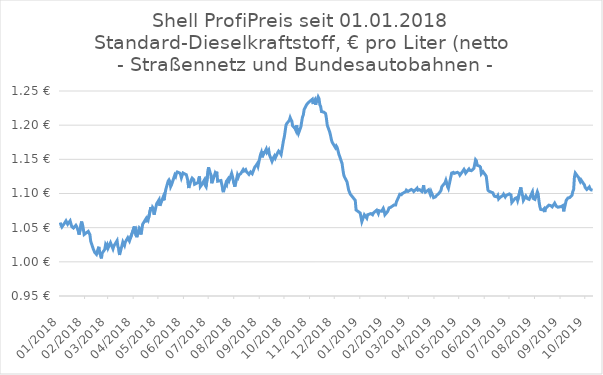
| Category | Diesel |
|---|---|
| 2019-10-12 | 1.105 |
| 2019-10-11 | 1.104 |
| 2019-10-10 | 1.105 |
| 2019-10-09 | 1.107 |
| 2019-10-08 | 1.11 |
| 2019-10-05 | 1.106 |
| 2019-10-03 | 1.109 |
| 2019-10-02 | 1.113 |
| 2019-10-01 | 1.114 |
| 2019-09-28 | 1.12 |
| 2019-09-27 | 1.117 |
| 2019-09-26 | 1.12 |
| 2019-09-25 | 1.123 |
| 2019-09-24 | 1.125 |
| 2019-09-21 | 1.13 |
| 2019-09-20 | 1.124 |
| 2019-09-19 | 1.106 |
| 2019-09-18 | 1.103 |
| 2019-09-17 | 1.097 |
| 2019-09-14 | 1.094 |
| 2019-09-13 | 1.093 |
| 2019-09-12 | 1.093 |
| 2019-09-11 | 1.093 |
| 2019-09-10 | 1.09 |
| 2019-09-07 | 1.074 |
| 2019-09-06 | 1.082 |
| 2019-09-05 | 1.082 |
| 2019-09-04 | 1.081 |
| 2019-09-03 | 1.082 |
| 2019-08-31 | 1.08 |
| 2019-08-30 | 1.081 |
| 2019-08-29 | 1.081 |
| 2019-08-28 | 1.081 |
| 2019-08-27 | 1.086 |
| 2019-08-24 | 1.08 |
| 2019-08-23 | 1.08 |
| 2019-08-22 | 1.082 |
| 2019-08-21 | 1.082 |
| 2019-08-20 | 1.083 |
| 2019-08-17 | 1.079 |
| 2019-08-16 | 1.078 |
| 2019-08-15 | 1.073 |
| 2019-08-14 | 1.077 |
| 2019-08-13 | 1.076 |
| 2019-08-10 | 1.077 |
| 2019-08-09 | 1.081 |
| 2019-08-08 | 1.088 |
| 2019-08-07 | 1.099 |
| 2019-08-06 | 1.102 |
| 2019-08-03 | 1.091 |
| 2019-08-02 | 1.091 |
| 2019-08-01 | 1.093 |
| 2019-07-31 | 1.102 |
| 2019-07-30 | 1.1 |
| 2019-07-27 | 1.091 |
| 2019-07-26 | 1.092 |
| 2019-07-25 | 1.092 |
| 2019-07-24 | 1.093 |
| 2019-07-23 | 1.096 |
| 2019-07-20 | 1.09 |
| 2019-07-19 | 1.097 |
| 2019-07-18 | 1.102 |
| 2019-07-17 | 1.109 |
| 2019-07-16 | 1.108 |
| 2019-07-13 | 1.09 |
| 2019-07-12 | 1.094 |
| 2019-07-11 | 1.093 |
| 2019-07-10 | 1.093 |
| 2019-07-09 | 1.092 |
| 2019-07-06 | 1.087 |
| 2019-07-05 | 1.098 |
| 2019-07-04 | 1.097 |
| 2019-07-03 | 1.099 |
| 2019-07-02 | 1.1 |
| 2019-06-29 | 1.097 |
| 2019-06-28 | 1.095 |
| 2019-06-27 | 1.096 |
| 2019-06-26 | 1.099 |
| 2019-06-25 | 1.097 |
| 2019-06-22 | 1.094 |
| 2019-06-20 | 1.092 |
| 2019-06-19 | 1.097 |
| 2019-06-18 | 1.095 |
| 2019-06-15 | 1.096 |
| 2019-06-14 | 1.098 |
| 2019-06-13 | 1.101 |
| 2019-06-12 | 1.102 |
| 2019-06-08 | 1.104 |
| 2019-06-07 | 1.105 |
| 2019-06-06 | 1.115 |
| 2019-06-05 | 1.125 |
| 2019-06-04 | 1.127 |
| 2019-06-01 | 1.132 |
| 2019-05-30 | 1.129 |
| 2019-05-29 | 1.138 |
| 2019-05-28 | 1.14 |
| 2019-05-25 | 1.141 |
| 2019-05-24 | 1.148 |
| 2019-05-23 | 1.149 |
| 2019-05-22 | 1.15 |
| 2019-05-21 | 1.137 |
| 2019-05-18 | 1.133 |
| 2019-05-17 | 1.134 |
| 2019-05-16 | 1.134 |
| 2019-05-15 | 1.136 |
| 2019-05-14 | 1.134 |
| 2019-05-11 | 1.13 |
| 2019-05-10 | 1.133 |
| 2019-05-09 | 1.135 |
| 2019-05-08 | 1.135 |
| 2019-05-07 | 1.132 |
| 2019-05-04 | 1.127 |
| 2019-05-03 | 1.129 |
| 2019-05-01 | 1.131 |
| 2019-04-30 | 1.132 |
| 2019-04-27 | 1.129 |
| 2019-04-26 | 1.131 |
| 2019-04-25 | 1.13 |
| 2019-04-24 | 1.13 |
| 2019-04-20 | 1.107 |
| 2019-04-19 | 1.11 |
| 2019-04-18 | 1.115 |
| 2019-04-17 | 1.119 |
| 2019-04-16 | 1.116 |
| 2019-04-13 | 1.111 |
| 2019-04-12 | 1.11 |
| 2019-04-11 | 1.104 |
| 2019-04-10 | 1.103 |
| 2019-04-09 | 1.101 |
| 2019-04-06 | 1.097 |
| 2019-04-05 | 1.098 |
| 2019-04-04 | 1.095 |
| 2019-04-03 | 1.094 |
| 2019-04-02 | 1.094 |
| 2019-03-30 | 1.103 |
| 2019-03-29 | 1.099 |
| 2019-03-28 | 1.1 |
| 2019-03-27 | 1.105 |
| 2019-03-26 | 1.105 |
| 2019-03-23 | 1.102 |
| 2019-03-22 | 1.104 |
| 2019-03-21 | 1.112 |
| 2019-03-20 | 1.105 |
| 2019-03-19 | 1.103 |
| 2019-03-16 | 1.106 |
| 2019-03-15 | 1.105 |
| 2019-03-14 | 1.105 |
| 2019-03-13 | 1.108 |
| 2019-03-12 | 1.108 |
| 2019-03-09 | 1.103 |
| 2019-03-08 | 1.104 |
| 2019-03-07 | 1.104 |
| 2019-03-06 | 1.106 |
| 2019-03-05 | 1.107 |
| 2019-03-02 | 1.103 |
| 2019-03-01 | 1.102 |
| 2019-02-28 | 1.105 |
| 2019-02-27 | 1.102 |
| 2019-02-26 | 1.103 |
| 2019-02-23 | 1.1 |
| 2019-02-22 | 1.098 |
| 2019-02-21 | 1.099 |
| 2019-02-20 | 1.099 |
| 2019-02-19 | 1.096 |
| 2019-02-16 | 1.088 |
| 2019-02-15 | 1.083 |
| 2019-02-14 | 1.084 |
| 2019-02-13 | 1.083 |
| 2019-02-12 | 1.084 |
| 2019-02-09 | 1.08 |
| 2019-02-08 | 1.08 |
| 2019-02-07 | 1.079 |
| 2019-02-06 | 1.076 |
| 2019-02-05 | 1.073 |
| 2019-02-02 | 1.069 |
| 2019-02-01 | 1.075 |
| 2019-01-31 | 1.078 |
| 2019-01-30 | 1.077 |
| 2019-01-29 | 1.074 |
| 2019-01-26 | 1.075 |
| 2019-01-25 | 1.071 |
| 2019-01-24 | 1.071 |
| 2019-01-23 | 1.076 |
| 2019-01-22 | 1.075 |
| 2019-01-19 | 1.072 |
| 2019-01-18 | 1.069 |
| 2019-01-17 | 1.07 |
| 2019-01-16 | 1.071 |
| 2019-01-15 | 1.071 |
| 2019-01-12 | 1.069 |
| 2019-01-11 | 1.064 |
| 2019-01-10 | 1.066 |
| 2019-01-09 | 1.065 |
| 2019-01-08 | 1.069 |
| 2019-01-05 | 1.059 |
| 2019-01-04 | 1.06 |
| 2019-01-03 | 1.071 |
| 2018-12-29 | 1.076 |
| 2018-12-28 | 1.09 |
| 2018-12-22 | 1.099 |
| 2018-12-21 | 1.102 |
| 2018-12-20 | 1.105 |
| 2018-12-18 | 1.117 |
| 2018-12-15 | 1.124 |
| 2018-12-14 | 1.128 |
| 2018-12-13 | 1.135 |
| 2018-12-12 | 1.144 |
| 2018-12-11 | 1.145 |
| 2018-12-08 | 1.158 |
| 2018-12-07 | 1.163 |
| 2018-12-06 | 1.168 |
| 2018-12-05 | 1.17 |
| 2018-12-04 | 1.167 |
| 2018-12-01 | 1.173 |
| 2018-11-30 | 1.175 |
| 2018-11-29 | 1.179 |
| 2018-11-28 | 1.185 |
| 2018-11-27 | 1.19 |
| 2018-11-24 | 1.2 |
| 2018-11-23 | 1.21 |
| 2018-11-22 | 1.217 |
| 2018-11-21 | 1.218 |
| 2018-11-20 | 1.219 |
| 2018-11-17 | 1.22 |
| 2018-11-16 | 1.228 |
| 2018-11-15 | 1.23 |
| 2018-11-14 | 1.239 |
| 2018-11-13 | 1.241 |
| 2018-11-10 | 1.23 |
| 2018-11-09 | 1.237 |
| 2018-11-08 | 1.235 |
| 2018-11-07 | 1.231 |
| 2018-11-06 | 1.238 |
| 2018-11-03 | 1.235 |
| 2018-11-01 | 1.233 |
| 2018-10-31 | 1.233 |
| 2018-10-30 | 1.23 |
| 2018-10-27 | 1.223 |
| 2018-10-26 | 1.215 |
| 2018-10-25 | 1.212 |
| 2018-10-24 | 1.205 |
| 2018-10-23 | 1.198 |
| 2018-10-20 | 1.188 |
| 2018-10-19 | 1.191 |
| 2018-10-18 | 1.2 |
| 2018-10-17 | 1.192 |
| 2018-10-16 | 1.195 |
| 2018-10-13 | 1.199 |
| 2018-10-12 | 1.206 |
| 2018-10-11 | 1.208 |
| 2018-10-10 | 1.211 |
| 2018-10-09 | 1.207 |
| 2018-10-06 | 1.202 |
| 2018-10-05 | 1.2 |
| 2018-10-03 | 1.184 |
| 2018-10-02 | 1.178 |
| 2018-09-29 | 1.157 |
| 2018-09-28 | 1.159 |
| 2018-09-27 | 1.16 |
| 2018-09-26 | 1.162 |
| 2018-09-25 | 1.16 |
| 2018-09-22 | 1.152 |
| 2018-09-21 | 1.155 |
| 2018-09-20 | 1.153 |
| 2018-09-19 | 1.15 |
| 2018-09-18 | 1.147 |
| 2018-09-15 | 1.156 |
| 2018-09-14 | 1.164 |
| 2018-09-13 | 1.162 |
| 2018-09-12 | 1.16 |
| 2018-09-11 | 1.165 |
| 2018-09-08 | 1.158 |
| 2018-09-07 | 1.162 |
| 2018-09-06 | 1.153 |
| 2018-09-05 | 1.16 |
| 2018-09-04 | 1.157 |
| 2018-09-01 | 1.14 |
| 2018-08-31 | 1.144 |
| 2018-08-30 | 1.142 |
| 2018-08-29 | 1.14 |
| 2018-08-28 | 1.138 |
| 2018-08-25 | 1.129 |
| 2018-08-23 | 1.132 |
| 2018-08-22 | 1.13 |
| 2018-08-21 | 1.128 |
| 2018-08-18 | 1.132 |
| 2018-08-17 | 1.135 |
| 2018-08-15 | 1.133 |
| 2018-08-14 | 1.135 |
| 2018-08-11 | 1.129 |
| 2018-08-10 | 1.128 |
| 2018-08-09 | 1.127 |
| 2018-08-08 | 1.124 |
| 2018-08-07 | 1.127 |
| 2018-08-04 | 1.11 |
| 2018-08-03 | 1.109 |
| 2018-08-02 | 1.119 |
| 2018-08-01 | 1.125 |
| 2018-07-31 | 1.13 |
| 2018-07-28 | 1.119 |
| 2018-07-27 | 1.122 |
| 2018-07-26 | 1.12 |
| 2018-07-25 | 1.113 |
| 2018-07-24 | 1.115 |
| 2018-07-21 | 1.102 |
| 2018-07-20 | 1.108 |
| 2018-07-19 | 1.114 |
| 2018-07-18 | 1.119 |
| 2018-07-17 | 1.12 |
| 2018-07-14 | 1.118 |
| 2018-07-13 | 1.132 |
| 2018-07-12 | 1.128 |
| 2018-07-11 | 1.13 |
| 2018-07-10 | 1.126 |
| 2018-07-07 | 1.115 |
| 2018-07-06 | 1.127 |
| 2018-07-05 | 1.13 |
| 2018-07-04 | 1.134 |
| 2018-07-03 | 1.138 |
| 2018-06-30 | 1.11 |
| 2018-06-29 | 1.112 |
| 2018-06-28 | 1.12 |
| 2018-06-27 | 1.118 |
| 2018-06-26 | 1.115 |
| 2018-06-23 | 1.11 |
| 2018-06-22 | 1.125 |
| 2018-06-21 | 1.12 |
| 2018-06-20 | 1.116 |
| 2018-06-19 | 1.117 |
| 2018-06-16 | 1.114 |
| 2018-06-15 | 1.12 |
| 2018-06-14 | 1.121 |
| 2018-06-13 | 1.122 |
| 2018-06-12 | 1.12 |
| 2018-06-09 | 1.108 |
| 2018-06-08 | 1.118 |
| 2018-06-07 | 1.123 |
| 2018-06-06 | 1.128 |
| 2018-06-05 | 1.128 |
| 2018-06-02 | 1.13 |
| 2018-05-31 | 1.123 |
| 2018-05-30 | 1.128 |
| 2018-05-29 | 1.13 |
| 2018-05-26 | 1.132 |
| 2018-05-25 | 1.13 |
| 2018-05-24 | 1.125 |
| 2018-05-23 | 1.127 |
| 2018-05-19 | 1.112 |
| 2018-05-18 | 1.11 |
| 2018-05-17 | 1.118 |
| 2018-05-16 | 1.12 |
| 2018-05-15 | 1.118 |
| 2018-05-12 | 1.106 |
| 2018-05-10 | 1.09 |
| 2018-05-09 | 1.095 |
| 2018-05-08 | 1.092 |
| 2018-05-05 | 1.082 |
| 2018-05-04 | 1.091 |
| 2018-05-03 | 1.092 |
| 2018-05-01 | 1.085 |
| 2018-04-28 | 1.069 |
| 2018-04-27 | 1.078 |
| 2018-04-26 | 1.08 |
| 2018-04-25 | 1.075 |
| 2018-04-24 | 1.08 |
| 2018-04-21 | 1.063 |
| 2018-04-20 | 1.066 |
| 2018-04-19 | 1.058 |
| 2018-04-18 | 1.063 |
| 2018-04-17 | 1.064 |
| 2018-04-14 | 1.055 |
| 2018-04-13 | 1.046 |
| 2018-04-12 | 1.04 |
| 2018-04-11 | 1.048 |
| 2018-04-10 | 1.05 |
| 2018-04-07 | 1.036 |
| 2018-04-06 | 1.046 |
| 2018-04-05 | 1.044 |
| 2018-04-04 | 1.052 |
| 2018-03-30 | 1.034 |
| 2018-03-29 | 1.03 |
| 2018-03-28 | 1.032 |
| 2018-03-27 | 1.035 |
| 2018-03-24 | 1.029 |
| 2018-03-23 | 1.024 |
| 2018-03-22 | 1.025 |
| 2018-03-21 | 1.029 |
| 2018-03-20 | 1.03 |
| 2018-03-17 | 1.01 |
| 2018-03-16 | 1.02 |
| 2018-03-15 | 1.022 |
| 2018-03-14 | 1.031 |
| 2018-03-13 | 1.03 |
| 2018-03-10 | 1.023 |
| 2018-03-09 | 1.019 |
| 2018-03-08 | 1.02 |
| 2018-03-07 | 1.025 |
| 2018-03-06 | 1.028 |
| 2018-03-03 | 1.02 |
| 2018-03-02 | 1.025 |
| 2018-03-01 | 1.022 |
| 2018-02-28 | 1.025 |
| 2018-02-27 | 1.018 |
| 2018-02-24 | 1.013 |
| 2018-02-23 | 1.005 |
| 2018-02-22 | 1.01 |
| 2018-02-21 | 1.012 |
| 2018-02-20 | 1.022 |
| 2018-02-17 | 1.011 |
| 2018-02-16 | 1.01 |
| 2018-02-15 | 1.014 |
| 2018-02-14 | 1.014 |
| 2018-02-13 | 1.019 |
| 2018-02-10 | 1.03 |
| 2018-02-09 | 1.04 |
| 2018-02-08 | 1.042 |
| 2018-02-07 | 1.045 |
| 2018-02-06 | 1.046 |
| 2018-02-02 | 1.04 |
| 2018-02-01 | 1.048 |
| 2018-01-31 | 1.055 |
| 2018-01-30 | 1.059 |
| 2018-01-27 | 1.04 |
| 2018-01-26 | 1.044 |
| 2018-01-25 | 1.045 |
| 2018-01-24 | 1.052 |
| 2018-01-23 | 1.054 |
| 2018-01-20 | 1.05 |
| 2018-01-19 | 1.05 |
| 2018-01-18 | 1.052 |
| 2018-01-17 | 1.053 |
| 2018-01-16 | 1.06 |
| 2018-01-13 | 1.055 |
| 2018-01-12 | 1.056 |
| 2018-01-11 | 1.06 |
| 2018-01-10 | 1.058 |
| 2018-01-09 | 1.057 |
| 2018-01-06 | 1.051 |
| 2018-01-05 | 1.053 |
| 2018-01-04 | 1.058 |
| 2018-01-03 | 1.057 |